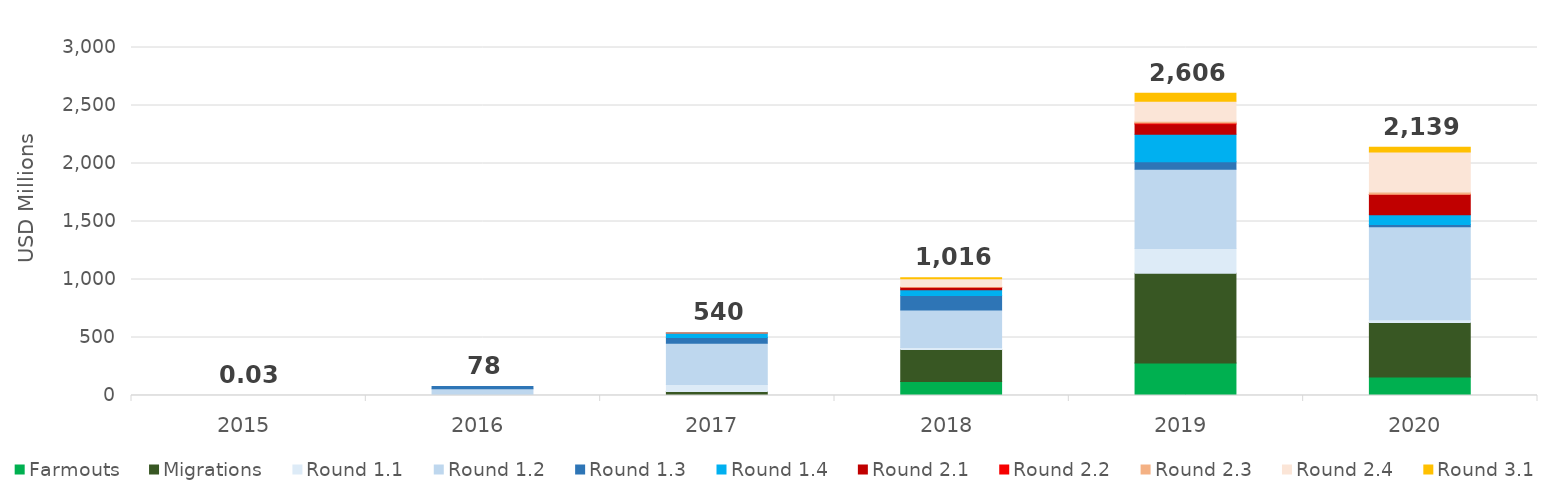
| Category | Farmouts | Migrations | Round 1.1 | Round 1.2 | Round 1.3 | Round 1.4 | Round 2.1 | Round 2.2 | Round 2.3 | Round 2.4 | Round 3.1 |
|---|---|---|---|---|---|---|---|---|---|---|---|
| 2015.0 | 0 | 0 | 0.023 | 0.003 | 0 | 0 | 0 | 0 | 0 | 0 | 0 |
| 2016.0 | 0 | 0 | 7.936 | 50.902 | 19.085 | 0 | 0 | 0 | 0 | 0 | 0 |
| 2017.0 | 1.551 | 32.93 | 60.276 | 356.292 | 49.073 | 38.707 | 0.93 | 0 | 0.096 | 0 | 0 |
| 2018.0 | 121.371 | 276.221 | 16.154 | 323.201 | 126.084 | 47.616 | 21.584 | 0.843 | 6.737 | 66.16 | 9.669 |
| 2019.0 | 280.617 | 772.208 | 213.486 | 685.106 | 64.331 | 235.595 | 88.72 | 9.392 | 14.554 | 173.042 | 69.349 |
| 2020.0 | 158.514 | 470.056 | 24.166 | 802.232 | 18.754 | 83.997 | 174.691 | 2.352 | 18.867 | 345.697 | 39.996 |